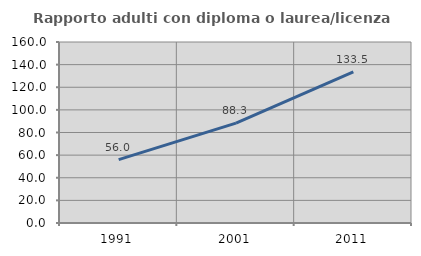
| Category | Rapporto adulti con diploma o laurea/licenza media  |
|---|---|
| 1991.0 | 56.028 |
| 2001.0 | 88.272 |
| 2011.0 | 133.526 |